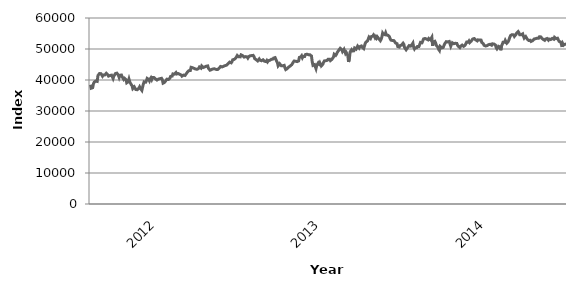
| Category | Series 0 |
|---|---|
|  | 38463.72 |
|  | 37341.29 |
|  | 37608.68 |
|  | 37516.2 |
|  | 38726.6 |
|  | 39288.13 |
|  | 39518.87 |
|  | 39660.19 |
|  | 39606.62 |
|  | 39542.67 |
|  | 41438.43 |
|  | 41732.3 |
|  | 42083.93 |
|  | 41912.98 |
|  | 42044.47 |
|  | 41792.46 |
|  | 41219.43 |
|  | 41581.98 |
|  | 41423.51 |
|  | 41616.3 |
|  | 41430.3 |
|  | 42161.4 |
|  | 42070.07 |
|  | 41669.41 |
|  | 41258.14 |
|  | 41499.43 |
|  | 41464.05 |
|  | 41605.56 |
|  | 41560.55 |
|  | 41533.87 |
|  | 40479.75 |
|  | 41236.46 |
|  | 41297.09 |
|  | 42068.69 |
|  | 42281.33 |
|  | 42209.33 |
|  | 41963.41 |
|  | 41529.19 |
|  | 40834.43 |
|  | 41526.42 |
|  | 41833.54 |
|  | 41608.37 |
|  | 41028.06 |
|  | 41267.16 |
|  | 40216.96 |
|  | 40562.55 |
|  | 40526.8 |
|  | 40141.26 |
|  | 39085.95 |
|  | 39305.37 |
|  | 39422.94 |
|  | 40273.65 |
|  | 39404.16 |
|  | 39278.24 |
|  | 38500.68 |
|  | 38157.26 |
|  | 37228.88 |
|  | 37255.68 |
|  | 37790.45 |
|  | 37887.74 |
|  | 36934.93 |
|  | 36852.75 |
|  | 36860.67 |
|  | 37178.24 |
|  | 37348.22 |
|  | 37793.58 |
|  | 37312.07 |
|  | 37287.97 |
|  | 36653.28 |
|  | 37707.25 |
|  | 38748.15 |
|  | 39417.95 |
|  | 39337.9 |
|  | 39286.64 |
|  | 39724.59 |
|  | 40511.78 |
|  | 40207.61 |
|  | 40187.43 |
|  | 39728.44 |
| 2012 | 40349.79 |
| 2012 | 40710.03 |
| 2012 | 40165.34 |
| 2012 | 40810.88 |
| 2012 | 40585.86 |
| 2012 | 40788.16 |
| 2012 | 41013.96 |
| 2012 | 40354.74 |
| 2012 | 40356.05 |
| 2012 | 39983.4 |
| 2012 | 39778.1 |
| 2012 | 40301.29 |
| 2012 | 40277.84 |
| 2012 | 40426.42 |
| 2012 | 40370.59 |
| 2012 | 40545.64 |
| 2012 | 40148.15 |
| 2012 | 38982.82 |
| 2012 | 39201.16 |
| 2012 | 39245.74 |
| 2012 | 39213.05 |
| 2012 | 39935.82 |
| 2012 | 40266.73 |
| 2012 | 40163.91 |
| 2012 | 40153.87 |
| 2012 | 39876.95 |
| 2012 | 40594.36 |
| 2012 | 41170.5 |
| 2012 | 41224.77 |
| 2012 | 41254 |
| 2012 | 41976.63 |
| 2012 | 41878.23 |
| 2012 | 41891.37 |
|  | 41997.92 |
|  | 42408.41 |
|  | 41940.79 |
|  | 41759.28 |
|  | 42095.04 |
|  | 41795.63 |
|  | 41852.69 |
|  | 41738.76 |
|  | 41600.89 |
|  | 41246.4 |
|  | 41077.44 |
|  | 41573.57 |
|  | 41731.43 |
|  | 41461.34 |
|  | 41627.2 |
|  | 42134.93 |
|  | 42503.57 |
|  | 42764.19 |
|  | 43010.58 |
|  | 42982.12 |
|  | 43047.41 |
|  | 44089.49 |
|  | 43896.55 |
|  | 43967.58 |
|  | 44173.5 |
|  | 43737.02 |
|  | 43701.32 |
|  | 43526.41 |
|  | 43822.42 |
|  | 43462.14 |
|  | 43763.3 |
|  | 43739.81 |
|  | 44183.21 |
|  | 44232.06 |
|  | 43840.23 |
|  | 44524.65 |
|  | 44376.95 |
|  | 44026.54 |
|  | 44234.24 |
|  | 44224.67 |
|  | 43988.28 |
|  | 44441.19 |
|  | 44353.53 |
|  | 44550.12 |
|  | 43759.43 |
|  | 43728.91 |
|  | 43145.55 |
|  | 43305.06 |
|  | 43374.6 |
|  | 43232.44 |
|  | 43581.92 |
|  | 43567.6 |
|  | 43600.51 |
|  | 43304.29 |
|  | 43429.42 |
|  | 43210.47 |
|  | 43368.99 |
|  | 43610.01 |
|  | 43825.87 |
|  | 43772.6 |
|  | 44369.05 |
|  | 44438.93 |
|  | 44218.33 |
|  | 44121.53 |
|  | 44436.63 |
|  | 44602.83 |
|  | 44655.24 |
|  | 44605.42 |
|  | 44787.84 |
|  | 45014.74 |
|  | 45293.43 |
|  | 45565.81 |
|  | 45772.59 |
|  | 46019.97 |
|  | 45538.45 |
|  | 45892.07 |
|  | 46517.46 |
|  | 46717.72 |
|  | 46653.84 |
|  | 46912.94 |
|  | 47089.1 |
|  | 47457.43 |
|  | 47920.75 |
|  | 47701.82 |
|  | 47479.87 |
|  | 47673.03 |
|  | 47460.59 |
|  | 48107.89 |
|  | 48222.72 |
|  | 47888.16 |
|  | 47589.33 |
|  | 47379.63 |
|  | 47407.28 |
|  | 47546.91 |
|  | 47440.8 |
|  | 47470.12 |
|  | 47086.54 |
|  | 47521.39 |
|  | 47661.37 |
|  | 47813.69 |
|  | 47936.61 |
|  | 47872.8 |
|  | 47733.24 |
|  | 47942.04 |
|  | 47613.95 |
|  | 46917.19 |
|  | 46840.15 |
|  | 46556.55 |
|  | 46674.78 |
|  | 46149.14 |
|  | 46329.66 |
|  | 46786.74 |
|  | 46399.26 |
|  | 46406.74 |
|  | 46211.54 |
|  | 46370.13 |
|  | 46508.27 |
|  | 46490.89 |
|  | 46051.76 |
|  | 45879.9 |
|  | 45948.12 |
|  | 46286.28 |
|  | 45868.35 |
|  | 46241.92 |
|  | 46280.36 |
|  | 46341.14 |
|  | 46137.7 |
|  | 46676.09 |
|  | 46762.65 |
|  | 46745.26 |
|  | 47074.39 |
|  | 46933.03 |
|  | 47223.68 |
|  | 47125.93 |
|  | 46068.24 |
|  | 45580.47 |
|  | 44585.1 |
|  | 44724.88 |
|  | 45247.9 |
|  | 45304.74 |
|  | 44623.89 |
|  | 44597.66 |
|  | 44590.97 |
|  | 44725.03 |
|  | 44724.14 |
|  | 43916.24 |
|  | 43364.7 |
|  | 43447.75 |
|  | 43665.21 |
|  | 43882.16 |
|  | 44162.18 |
|  | 43991.51 |
|  | 44541.73 |
|  | 44742.22 |
|  | 44943.16 |
|  | 45207.84 |
|  | 45771.11 |
|  | 46102.42 |
|  | 45992.03 |
|  | 46078.68 |
|  | 45851.8 |
|  | 45933.66 |
|  | 45687.76 |
|  | 46145.44 |
|  | 47277.1 |
|  | 47579.87 |
|  | 47476.64 |
|  | 47806.34 |
|  | 47175.79 |
|  | 47620.68 |
|  | 47805.94 |
|  | 47573.66 |
|  | 48209.65 |
|  | 48495.01 |
|  | 48324.52 |
|  | 48383.93 |
|  | 48152.82 |
|  | 48273.42 |
| 2013 | 48131.61 |
| 2013 | 48119.72 |
| 2013 | 47743.1 |
| 2013 | 45870 |
| 2013 | 44732.92 |
| 2013 | 44824.62 |
| 2013 | 44966.09 |
| 2013 | 44893.99 |
| 2013 | 43667.37 |
| 2013 | 44747.79 |
| 2013 | 44769 |
| 2013 | 45533.94 |
| 2013 | 45184.98 |
| 2013 | 45613.75 |
| 2013 | 45110.89 |
| 2013 | 44534.34 |
| 2013 | 44342.23 |
| 2013 | 45068.55 |
| 2013 | 45712.72 |
| 2013 | 46150.78 |
| 2013 | 46218.05 |
| 2013 | 46221.23 |
| 2013 | 46399.74 |
| 2013 | 46361.7 |
| 2013 | 46714.43 |
| 2013 | 46835.98 |
| 2013 | 46713.02 |
| 2013 | 46258.91 |
| 2013 | 46480.62 |
| 2013 | 46663.41 |
| 2013 | 46925.65 |
|  | 47370.81 |
|  | 48325.33 |
|  | 48458.44 |
|  | 47942.81 |
|  | 48306.55 |
|  | 48862.88 |
|  | 49125.36 |
|  | 49580.16 |
|  | 49747.66 |
|  | 50223.95 |
|  | 49976.48 |
|  | 49772.46 |
|  | 49162.16 |
|  | 49128.05 |
|  | 49895.1 |
|  | 49818.48 |
|  | 48537.65 |
|  | 48871.98 |
|  | 49187.22 |
|  | 47919.09 |
|  | 45830.66 |
|  | 46717.04 |
|  | 48961.51 |
|  | 49437.02 |
|  | 49771.55 |
|  | 49348.61 |
|  | 49434.46 |
|  | 49413.33 |
|  | 50300.53 |
|  | 50308.19 |
|  | 49955.87 |
|  | 49979.47 |
|  | 50936.34 |
|  | 50819.81 |
|  | 50301.85 |
|  | 50782.48 |
|  | 50803.4 |
|  | 50982.03 |
|  | 50601.24 |
|  | 50338.71 |
|  | 50137.88 |
|  | 50335.02 |
|  | 51806.83 |
|  | 52230.47 |
|  | 52520.91 |
|  | 52590.73 |
|  | 52861.41 |
|  | 53853.55 |
|  | 53781.81 |
|  | 53389.74 |
|  | 53994.46 |
|  | 53887.13 |
|  | 54180.04 |
|  | 54536.95 |
|  | 54095.32 |
|  | 53607.86 |
|  | 53989.37 |
|  | 53504.47 |
|  | 53924.01 |
|  | 53785.07 |
|  | 53305.36 |
|  | 53358.29 |
|  | 52681.33 |
|  | 53127.16 |
|  | 53896.03 |
|  | 55136.81 |
|  | 54778.86 |
|  | 54778.8 |
|  | 54621.21 |
|  | 55246.4 |
|  | 54544.73 |
|  | 54678.66 |
|  | 54420.19 |
|  | 54704.89 |
|  | 53934.52 |
|  | 53276.83 |
|  | 52867.03 |
|  | 52597.13 |
|  | 52727.52 |
|  | 52881.29 |
|  | 52692.63 |
|  | 52643.16 |
|  | 51947.96 |
|  | 51761.82 |
|  | 51736.02 |
|  | 50779.25 |
|  | 50971.57 |
|  | 50631.75 |
|  | 51097.75 |
|  | 51362.3 |
|  | 51267.29 |
|  | 51284.25 |
|  | 51865.89 |
|  | 51497.81 |
|  | 50444.78 |
|  | 50482.93 |
|  | 49753.03 |
|  | 49796.5 |
|  | 50444.23 |
|  | 50605.74 |
|  | 51098.55 |
|  | 51288.7 |
|  | 50925.12 |
|  | 50917.69 |
|  | 51506.82 |
|  | 51906.45 |
|  | 50593.45 |
|  | 50041.93 |
|  | 50433.71 |
|  | 50128.34 |
|  | 50417.17 |
|  | 50831.61 |
|  | 51121.82 |
|  | 50836.32 |
|  | 51076.06 |
|  | 52138.87 |
|  | 52137.9 |
|  | 52024.29 |
|  | 52581.53 |
|  | 53231.44 |
|  | 53349.65 |
|  | 53397.03 |
|  | 53435.4 |
|  | 53208.77 |
|  | 53471.61 |
|  | 52967.02 |
|  | 53400.11 |
|  | 53687.8 |
|  | 52983.97 |
|  | 52906.04 |
|  | 53811.3 |
|  | 51005.81 |
|  | 52303.63 |
|  | 52216.05 |
|  | 52487.84 |
|  | 51954.46 |
|  | 51155.33 |
|  | 51226.9 |
|  | 50517.28 |
|  | 49878.65 |
|  | 49520.84 |
|  | 50811.88 |
|  | 50651.51 |
|  | 50360.09 |
|  | 50555.93 |
|  | 50503.6 |
|  | 51150.79 |
|  | 51684.41 |
|  | 51642.99 |
|  | 52373.47 |
|  | 52660.68 |
|  | 52280.5 |
|  | 52449.94 |
|  | 52429.68 |
|  | 52580.73 |
|  | 50913.63 |
|  | 51510.98 |
|  | 52026.61 |
|  | 51936.09 |
|  | 51705.76 |
|  | 51497.7 |
|  | 51842.78 |
|  | 51892.77 |
|  | 51782.38 |
|  | 51198.42 |
|  | 50873.54 |
|  | 50851.25 |
|  | 50451.79 |
|  | 50897.34 |
|  | 51047.96 |
|  | 51264.01 |
|  | 50944.5 |
|  | 50858.58 |
|  | 51070.22 |
|  | 51244.43 |
|  | 51391.94 |
|  | 52244.13 |
|  | 52413.38 |
|  | 52187.17 |
|  | 52553.48 |
|  | 52066.97 |
|  | 52326.4 |
|  | 52527.75 |
|  | 52901.29 |
|  | 53233.18 |
|  | 53054.18 |
|  | 53368.74 |
|  | 53120.87 |
|  | 52927.91 |
|  | 52759.01 |
|  | 52618.29 |
|  | 52943.98 |
| 2014 | 52937.45 |
| 2014 | 52923.26 |
| 2014 | 53084.62 |
| 2014 | 52870.49 |
| 2014 | 52096.37 |
| 2014 | 51815.43 |
| 2014 | 51713.44 |
| 2014 | 51191.13 |
| 2014 | 50951.73 |
| 2014 | 50974.9 |
| 2014 | 50716.2 |
| 2014 | 51085.89 |
| 2014 | 51310.6 |
| 2014 | 51408.74 |
| 2014 | 51445.92 |
| 2014 | 51527.37 |
| 2014 | 51315.91 |
| 2014 | 51228.68 |
| 2014 | 51667.6 |
| 2014 | 51540.81 |
| 2014 | 51608.79 |
| 2014 | 51568.84 |
| 2014 | 51275.06 |